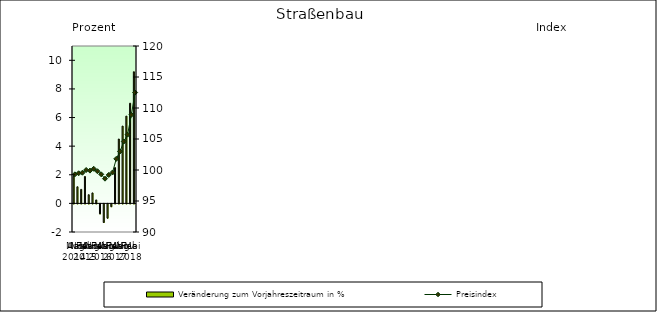
| Category | Veränderung zum Vorjahreszeitraum in % |
|---|---|
| 0 | 1.892 |
| 1 | 1.161 |
| 2 | 0.98 |
| 3 | 1.878 |
| 4 | 0.607 |
| 5 | 0.731 |
| 6 | 0.24 |
| 7 | -0.7 |
| 8 | -1.3 |
| 9 | -1 |
| 10 | -0.2 |
| 11 | 2.5 |
| 12 | 4.5 |
| 13 | 5.4 |
| 14 | 6.1 |
| 15 | 7 |
| 16 | 9.2 |